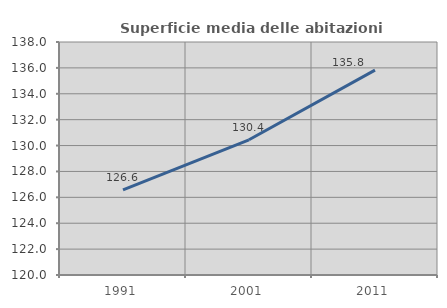
| Category | Superficie media delle abitazioni occupate |
|---|---|
| 1991.0 | 126.578 |
| 2001.0 | 130.447 |
| 2011.0 | 135.827 |